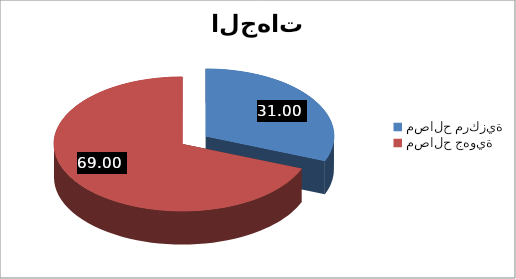
| Category | توزيع الموظفين حسب الجهات |
|---|---|
| مصالح مركزية | 31.004 |
| مصالح جهوية | 68.996 |